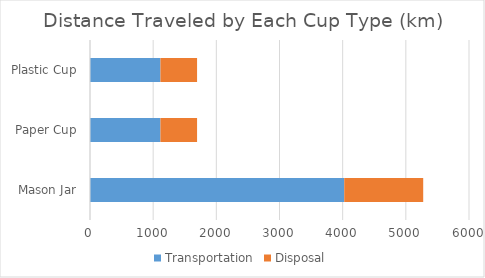
| Category | Transportation | Disposal |
|---|---|---|
| Mason Jar | 4025 | 1250 |
| Paper Cup | 1115 | 580 |
| Plastic Cup | 1115 | 580 |